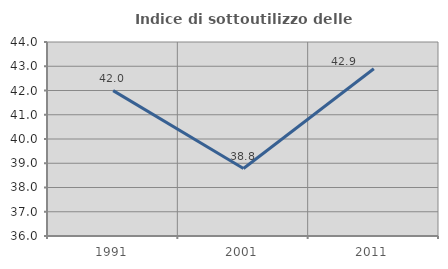
| Category | Indice di sottoutilizzo delle abitazioni  |
|---|---|
| 1991.0 | 41.995 |
| 2001.0 | 38.781 |
| 2011.0 | 42.899 |